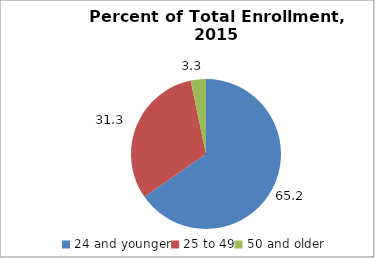
| Category | Series 0 |
|---|---|
| 24 and younger | 65.209 |
| 25 to 49 | 31.323 |
| 50 and older | 3.271 |